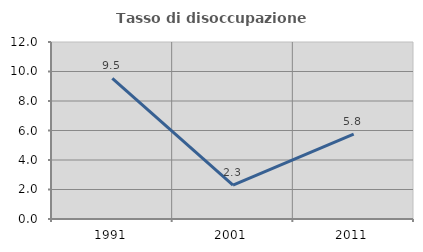
| Category | Tasso di disoccupazione giovanile  |
|---|---|
| 1991.0 | 9.542 |
| 2001.0 | 2.29 |
| 2011.0 | 5.758 |